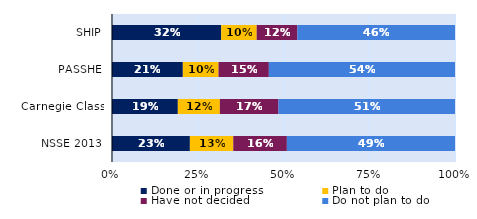
| Category | Done or in progress | Plan to do | Have not decided | Do not plan to do |
|---|---|---|---|---|
| SHIP | 0.318 | 0.103 | 0.119 | 0.46 |
| PASSHE | 0.207 | 0.104 | 0.147 | 0.543 |
| Carnegie Class | 0.192 | 0.123 | 0.171 | 0.515 |
| NSSE 2013 | 0.227 | 0.127 | 0.156 | 0.49 |